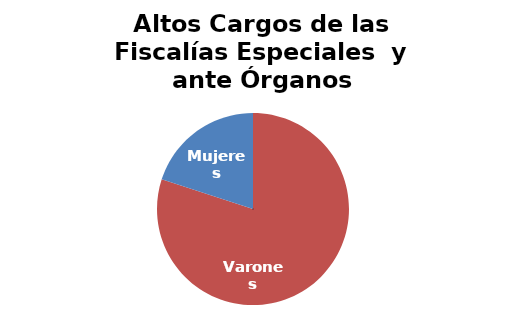
| Category | Altos Cargos de las Fiscalías Especiales  y ante Órganos Constitucionales |
|---|---|
| Varones | 4 |
| Mujeres | 1 |